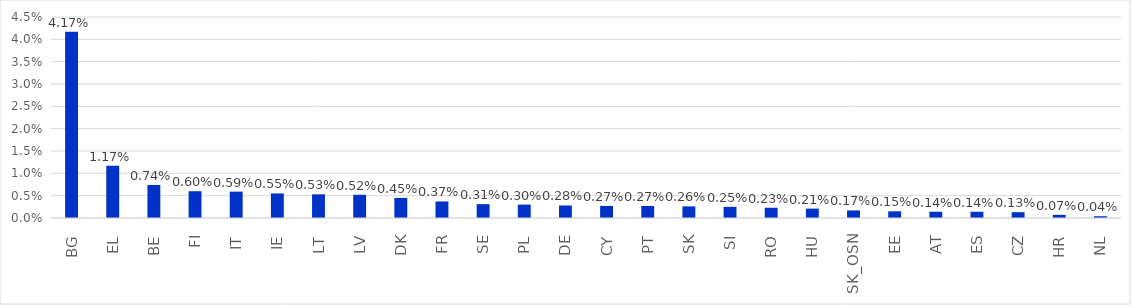
| Category | Series 0 |
|---|---|
| BG | 0.042 |
| EL | 0.012 |
| BE | 0.007 |
| FI | 0.006 |
| IT | 0.006 |
| IE | 0.006 |
| LT | 0.005 |
| LV | 0.005 |
| DK | 0.005 |
| FR | 0.004 |
| SE | 0.003 |
| PL | 0.003 |
| DE | 0.003 |
| CY | 0.003 |
| PT | 0.003 |
| SK | 0.003 |
| SI | 0.002 |
| RO | 0.002 |
| HU | 0.002 |
| SK_OSN | 0.002 |
| EE | 0.002 |
| AT | 0.001 |
| ES | 0.001 |
| CZ | 0.001 |
| HR | 0.001 |
| NL | 0 |